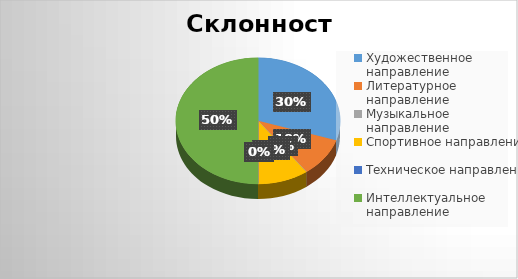
| Category | Series 0 |
|---|---|
| Художественное направление | 3 |
| Литературное направление | 1 |
| Музыкальное направление | 0 |
| Спортивное направление | 1 |
| Техническое направление | 0 |
| Интеллектуальное направление | 5 |